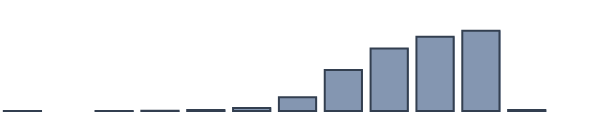
| Category | Series 0 |
|---|---|
| 0 | 0.043 |
| 1 | 0 |
| 2 | 0.043 |
| 3 | 0.087 |
| 4 | 0.348 |
| 5 | 1.087 |
| 6 | 5 |
| 7 | 14.739 |
| 8 | 22.565 |
| 9 | 26.783 |
| 10 | 28.957 |
| 11 | 0.348 |
| 12 | 0 |